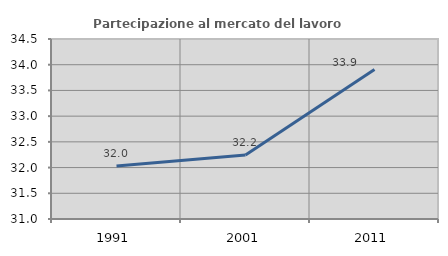
| Category | Partecipazione al mercato del lavoro  femminile |
|---|---|
| 1991.0 | 32.028 |
| 2001.0 | 32.243 |
| 2011.0 | 33.907 |